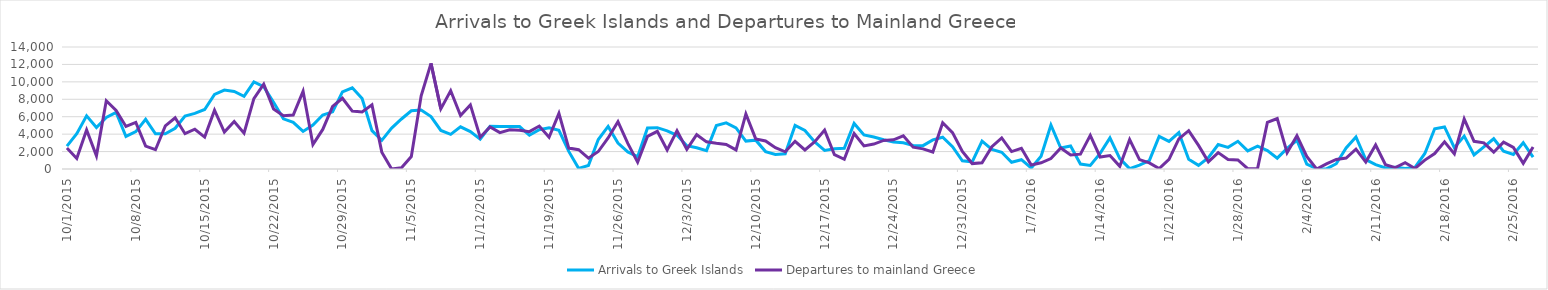
| Category | Arrivals to Greek Islands | Departures to mainland Greece |
|---|---|---|
| 10/1/15 | 2631 | 2409 |
| 10/2/15 | 4055 | 1215 |
| 10/3/15 | 6097 | 4480 |
| 10/4/15 | 4763 | 1513 |
| 10/5/15 | 5909 | 7833 |
| 10/6/15 | 6496 | 6707 |
| 10/7/15 | 3734 | 4886 |
| 10/8/15 | 4295 | 5349 |
| 10/9/15 | 5695 | 2631 |
| 10/10/15 | 4045 | 2214 |
| 10/11/15 | 4034 | 4950 |
| 10/12/15 | 4671 | 5879 |
| 10/13/15 | 6079 | 4052 |
| 10/14/15 | 6380 | 4564 |
| 10/15/15 | 6830 | 3660 |
| 10/16/15 | 8564 | 6743 |
| 10/17/15 | 9063 | 4239 |
| 10/18/15 | 8900 | 5457 |
| 10/19/15 | 8337 | 4119 |
| 10/20/15 | 10006 | 8083 |
| 10/21/15 | 9444 | 9725 |
| 10/22/15 | 7651 | 6896 |
| 10/23/15 | 5762 | 6120 |
| 10/24/15 | 5354 | 6195 |
| 10/25/15 | 4311 | 8916 |
| 10/26/15 | 5049 | 2804 |
| 10/27/15 | 6195 | 4540 |
| 10/28/15 | 6557 | 7191 |
| 10/29/15 | 8847 | 8117 |
| 10/30/15 | 9323 | 6649 |
| 10/31/15 | 8089 | 6537 |
| 11/1/15 | 4400 | 7360 |
| 11/2/15 | 3290 | 1935 |
| 11/3/15 | 4689 | 0 |
| 11/4/15 | 5740 | 142 |
| 11/5/15 | 6679 | 1430 |
| 11/6/15 | 6765 | 8392 |
| 11/7/15 | 6022 | 12116 |
| 11/8/15 | 4425 | 6902 |
| 11/9/15 | 3979 | 8977 |
| 11/10/15 | 4842 | 6133 |
| 11/11/15 | 4296 | 7354 |
| 11/12/15 | 3425 | 3650 |
| 11/13/15 | 4909 | 4820 |
| 11/14/15 | 4884 | 4171 |
| 11/15/15 | 4891 | 4497 |
| 11/16/15 | 4873 | 4442 |
| 11/17/15 | 3873 | 4289 |
| 11/18/15 | 4499 | 4927 |
| 11/19/15 | 4737 | 3644 |
| 11/20/15 | 4432 | 6389 |
| 11/21/15 | 2020 | 2401 |
| 11/22/15 | 76 | 2214 |
| 11/23/15 | 409 | 1245 |
| 11/24/15 | 3383 | 2006 |
| 11/25/15 | 4889 | 3565 |
| 11/26/15 | 2973 | 5435 |
| 11/27/15 | 1961 | 2932 |
| 11/28/15 | 1420 | 778 |
| 11/29/15 | 4703 | 3736 |
| 11/30/15 | 4744 | 4318 |
| 12/1/15 | 4386 | 2181 |
| 12/2/15 | 3863 | 4384 |
| 12/3/15 | 2671 | 2255 |
| 12/4/15 | 2435 | 3934 |
| 12/5/15 | 2110 | 3115 |
| 12/6/15 | 4978 | 2943 |
| 12/7/15 | 5287 | 2810 |
| 12/8/15 | 4721 | 2189 |
| 12/9/15 | 3203 | 6316 |
| 12/10/15 | 3308 | 3456 |
| 12/11/15 | 1999 | 3219 |
| 12/12/15 | 1671 | 2453 |
| 12/13/15 | 1738 | 1976 |
| 12/14/15 | 5005 | 3175 |
| 12/15/15 | 4421 | 2191 |
| 12/16/15 | 3105 | 3137 |
| 12/17/15 | 2135 | 4461 |
| 12/18/15 | 2330 | 1638 |
| 12/19/15 | 2373 | 1110 |
| 12/20/15 | 5223 | 4070 |
| 12/21/15 | 3904 | 2652 |
| 12/22/15 | 3668 | 2864 |
| 12/23/15 | 3354 | 3278 |
| 12/24/15 | 3110 | 3349 |
| 12/25/15 | 3008 | 3806 |
| 12/26/15 | 2710 | 2498 |
| 12/27/15 | 2678 | 2311 |
| 12/28/15 | 3337 | 1946 |
| 12/29/15 | 3643 | 5309 |
| 12/30/15 | 2552 | 4178 |
| 12/31/15 | 948 | 2009 |
| 1/1/16 | 828 | 623 |
| 1/2/16 | 3203 | 720 |
| 1/3/16 | 2241 | 2569 |
| 1/4/16 | 1917 | 3563 |
| 1/5/16 | 779 | 1998 |
| 1/6/16 | 1067 | 2377 |
| 1/7/16 | 119 | 463 |
| 1/8/16 | 1475 | 716 |
| 1/9/16 | 5050 | 1203 |
| 1/10/16 | 2410 | 2417 |
| 1/11/16 | 2645 | 1621 |
| 1/12/16 | 571 | 1701 |
| 1/13/16 | 408 | 3861 |
| 1/14/16 | 1792 | 1378 |
| 1/15/16 | 3564 | 1551 |
| 1/16/16 | 1188 | 301 |
| 1/17/16 | 39 | 3378 |
| 1/18/16 | 435 | 1078 |
| 1/19/16 | 964 | 695 |
| 1/20/16 | 3748 | 50 |
| 1/21/16 | 3166 | 1108 |
| 1/22/16 | 4176 | 3451 |
| 1/23/16 | 1124 | 4397 |
| 1/24/16 | 418 | 2706 |
| 1/25/16 | 1295 | 819 |
| 1/26/16 | 2808 | 1887 |
| 1/27/16 | 2488 | 1098 |
| 1/28/16 | 3180 | 1046 |
| 1/29/16 | 2076 | 40 |
| 1/30/16 | 2623 | 53 |
| 1/31/16 | 2105 | 5342 |
| 2/1/16 | 1244 | 5783 |
| 2/2/16 | 2368 | 1878 |
| 2/3/16 | 3299 | 3829 |
| 2/4/16 | 565 | 1436 |
| 2/5/16 | 38 | 0 |
| 2/6/16 | 7 | 578 |
| 2/7/16 | 608 | 1097 |
| 2/8/16 | 2418 | 1259 |
| 2/9/16 | 3676 | 2283 |
| 2/10/16 | 1071 | 793 |
| 2/11/16 | 502 | 2756 |
| 2/12/16 | 123 | 496 |
| 2/13/16 | 186 | 161 |
| 2/14/16 | 51 | 724 |
| 2/15/16 | 181 | 65 |
| 2/16/16 | 1783 | 1024 |
| 2/17/16 | 4611 | 1772 |
| 2/18/16 | 4824 | 3118 |
| 2/19/16 | 2440 | 1731 |
| 2/20/16 | 3772 | 5738 |
| 2/21/16 | 1618 | 3180 |
| 2/22/16 | 2545 | 3002 |
| 2/23/16 | 3474 | 1927 |
| 2/24/16 | 2044 | 3086 |
| 2/25/16 | 1675 | 2468 |
| 2/26/16 | 3021 | 649 |
| 2/27/16 | 1355 | 2525 |